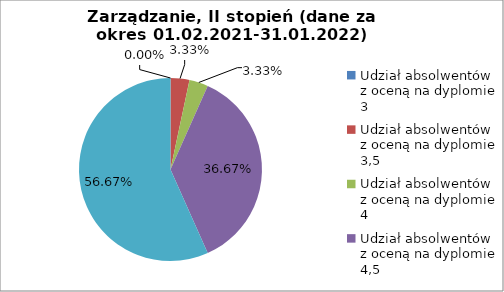
| Category | Series 0 |
|---|---|
| Udział absolwentów z oceną na dyplomie 3 | 0 |
| Udział absolwentów z oceną na dyplomie 3,5 | 3.333 |
| Udział absolwentów z oceną na dyplomie 4 | 3.333 |
| Udział absolwentów z oceną na dyplomie 4,5 | 36.667 |
| Udział absolwentów z oceną na dyplomie 5 | 56.667 |